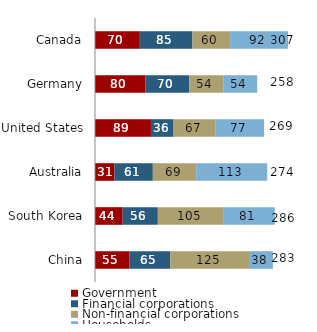
| Category | Government | Financial corporations | Non-financial corporations | Households |
|---|---|---|---|---|
| China | 55 | 65 | 125 | 38 |
| South Korea | 44 | 56 | 105 | 81 |
| Australia | 31 | 61 | 69 | 113 |
| United States | 89 | 36 | 67 | 77 |
| Germany | 80 | 70 | 54 | 54 |
| Canada | 70 | 85 | 60 | 92 |